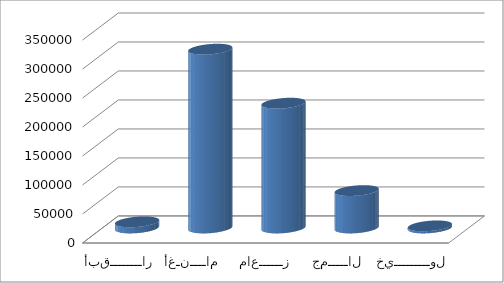
| Category | Series 0 |
|---|---|
| أبقــــــــار | 10649 |
| أغـنــــام | 308414 |
| ماعــــــز | 215278 |
| جمـــــال | 64551 |
| خيـــــــــول | 3674 |